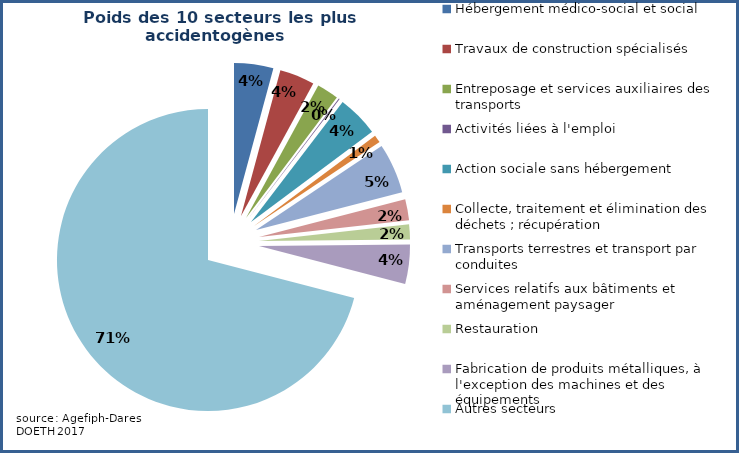
| Category | Series 0 |
|---|---|
| Hébergement médico-social et social | 0.042 |
| Travaux de construction spécialisés | 0.037 |
| Entreposage et services auxiliaires des transports | 0.023 |
| Activités liées à l'emploi | 0.001 |
| Action sociale sans hébergement | 0.044 |
| Collecte, traitement et élimination des déchets ; récupération | 0.008 |
| Transports terrestres et transport par conduites | 0.053 |
| Services relatifs aux bâtiments et aménagement paysager | 0.023 |
| Restauration | 0.016 |
| Fabrication de produits métalliques, à l'exception des machines et des équipements | 0.042 |
| Autres secteurs | 0.71 |